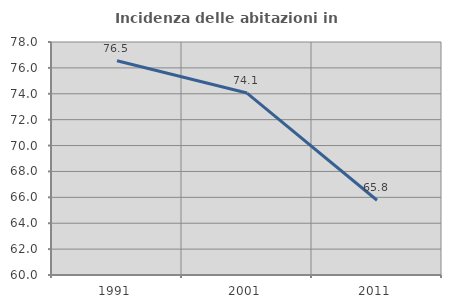
| Category | Incidenza delle abitazioni in proprietà  |
|---|---|
| 1991.0 | 76.546 |
| 2001.0 | 74.055 |
| 2011.0 | 65.774 |